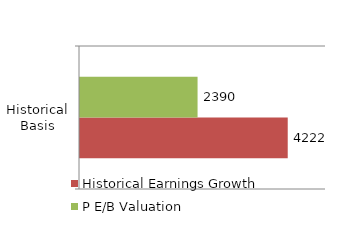
| Category | Historical Earnings Growth | P E/B Valuation |
|---|---|---|
| 0 | 4222.133 | 2389.618 |